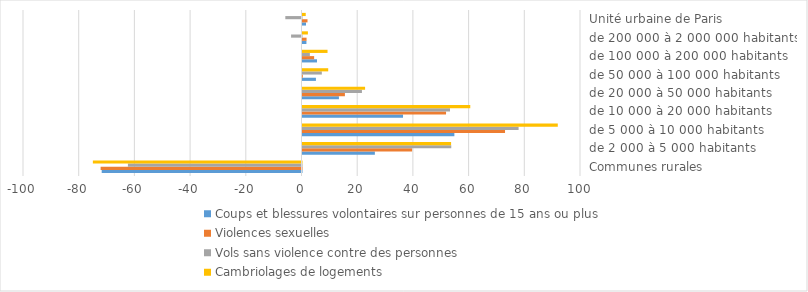
| Category | Coups et blessures volontaires sur personnes de 15 ans ou plus | Violences sexuelles | Vols sans violence contre des personnes | Cambriolages de logements |
|---|---|---|---|---|
| Communes rurales | -71.739 | -72.134 | -62.326 | -74.913 |
| de 2 000 à 5 000 habitants | 25.986 | 39.359 | 53.414 | 53.355 |
| de 5 000 à 10 000 habitants | 54.531 | 72.721 | 77.589 | 91.666 |
| de 10 000 à 20 000 habitants | 36.096 | 51.542 | 52.96 | 60.242 |
| de 20 000 à 50 000 habitants | 13.078 | 15.227 | 21.342 | 22.475 |
| de 50 000 à 100 000 habitants | 4.818 | 0.117 | 6.932 | 9.232 |
| de 100 000 à 200 000 habitants | 5.205 | 4.177 | 2.643 | 8.988 |
| de 200 000 à 2 000 000 habitants | 1.41 | 1.462 | -3.743 | 1.936 |
| Unité urbaine de Paris | 1.253 | 1.797 | -5.81 | 1.158 |